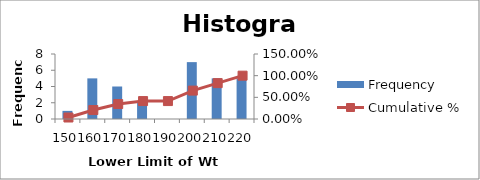
| Category | Frequency |
|---|---|
| 150.0 | 1 |
| 160.0 | 5 |
| 170.0 | 4 |
| 180.0 | 2 |
| 190.0 | 0 |
| 200.0 | 7 |
| 210.0 | 5 |
| 220.0 | 5 |